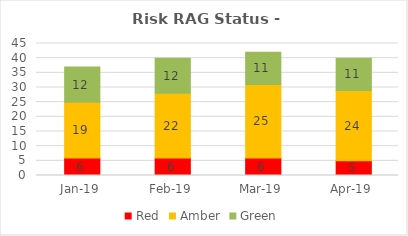
| Category | Red | Amber | Green |
|---|---|---|---|
| 2019-01-01 | 6 | 19 | 12 |
| 2019-02-01 | 6 | 22 | 12 |
| 2019-03-01 | 6 | 25 | 11 |
| 2019-04-01 | 5 | 24 | 11 |